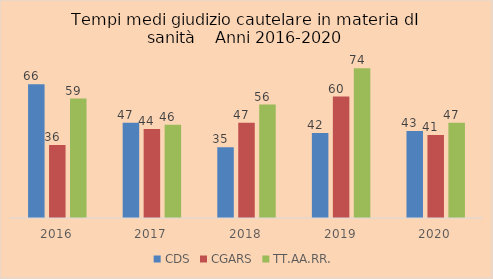
| Category | CDS | CGARS | TT.AA.RR. |
|---|---|---|---|
| 2016.0 | 66 | 36 | 59 |
| 2017.0 | 47 | 44 | 46 |
| 2018.0 | 35 | 47 | 56 |
| 2019.0 | 42 | 60 | 74 |
| 2020.0 | 43 | 41 | 47 |